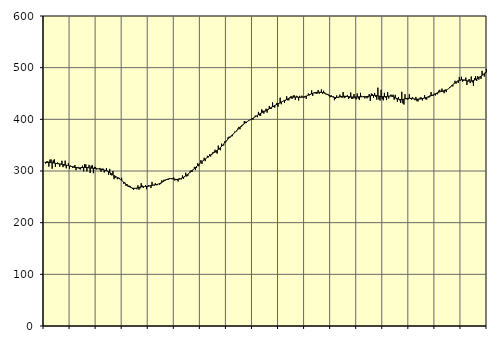
| Category | Piggar | Series 1 |
|---|---|---|
| nan | 316.8 | 316.88 |
| 87.0 | 314.3 | 316.68 |
| 87.0 | 318.7 | 316.62 |
| 87.0 | 318.7 | 316.62 |
| 87.0 | 308.5 | 316.53 |
| 87.0 | 322 | 316.45 |
| 87.0 | 322.4 | 316.24 |
| 87.0 | 304.4 | 316.01 |
| 87.0 | 320.6 | 315.75 |
| 87.0 | 322.7 | 315.37 |
| 87.0 | 307.9 | 314.99 |
| 87.0 | 313.6 | 314.59 |
| nan | 316.4 | 314.2 |
| 88.0 | 315.1 | 313.85 |
| 88.0 | 308.2 | 313.54 |
| 88.0 | 314 | 313.25 |
| 88.0 | 319.8 | 312.97 |
| 88.0 | 307.4 | 312.65 |
| 88.0 | 310 | 312.27 |
| 88.0 | 320.1 | 311.85 |
| 88.0 | 305.2 | 311.4 |
| 88.0 | 310.9 | 310.86 |
| 88.0 | 315.5 | 310.31 |
| 88.0 | 304.3 | 309.76 |
| nan | 310.4 | 309.19 |
| 89.0 | 309.2 | 308.62 |
| 89.0 | 305.9 | 308.06 |
| 89.0 | 309.1 | 307.5 |
| 89.0 | 311.6 | 306.98 |
| 89.0 | 301.5 | 306.56 |
| 89.0 | 307 | 306.28 |
| 89.0 | 307.9 | 306.14 |
| 89.0 | 303.8 | 306.12 |
| 89.0 | 302.9 | 306.19 |
| 89.0 | 307.9 | 306.34 |
| 89.0 | 310.3 | 306.51 |
| nan | 299.3 | 306.67 |
| 90.0 | 313.1 | 306.75 |
| 90.0 | 312.9 | 306.74 |
| 90.0 | 299.2 | 306.64 |
| 90.0 | 306 | 306.42 |
| 90.0 | 311.8 | 306.16 |
| 90.0 | 296.1 | 305.89 |
| 90.0 | 310.2 | 305.62 |
| 90.0 | 311.1 | 305.39 |
| 90.0 | 295.7 | 305.23 |
| 90.0 | 308.1 | 305.06 |
| 90.0 | 307.8 | 304.86 |
| nan | 303 | 304.63 |
| 91.0 | 304.5 | 304.35 |
| 91.0 | 303.9 | 303.99 |
| 91.0 | 305.9 | 303.62 |
| 91.0 | 298.7 | 303.22 |
| 91.0 | 304.6 | 302.77 |
| 91.0 | 304.5 | 302.29 |
| 91.0 | 297.1 | 301.76 |
| 91.0 | 300.6 | 301.14 |
| 91.0 | 305.7 | 300.41 |
| 91.0 | 300.4 | 299.54 |
| 91.0 | 292.4 | 298.47 |
| nan | 304.1 | 297.2 |
| 92.0 | 292.4 | 295.79 |
| 92.0 | 291.4 | 294.3 |
| 92.0 | 300 | 292.81 |
| 92.0 | 284.1 | 291.37 |
| 92.0 | 286.6 | 290.02 |
| 92.0 | 289.1 | 288.73 |
| 92.0 | 284.1 | 287.47 |
| 92.0 | 287.3 | 286.19 |
| 92.0 | 286.6 | 284.81 |
| 92.0 | 283.3 | 283.33 |
| 92.0 | 286.8 | 281.75 |
| nan | 280.1 | 280.09 |
| 93.0 | 275.3 | 278.31 |
| 93.0 | 277.6 | 276.5 |
| 93.0 | 271 | 274.65 |
| 93.0 | 274.6 | 272.84 |
| 93.0 | 269.3 | 271.21 |
| 93.0 | 271.6 | 269.76 |
| 93.0 | 270.4 | 268.53 |
| 93.0 | 268.3 | 267.57 |
| 93.0 | 265.2 | 266.9 |
| 93.0 | 263.5 | 266.5 |
| 93.0 | 267.3 | 266.4 |
| nan | 266.3 | 266.58 |
| 94.0 | 264.7 | 266.99 |
| 94.0 | 272.3 | 267.55 |
| 94.0 | 263.8 | 268.18 |
| 94.0 | 266.4 | 268.77 |
| 94.0 | 276.4 | 269.24 |
| 94.0 | 271.7 | 269.57 |
| 94.0 | 267.2 | 269.75 |
| 94.0 | 269.9 | 269.84 |
| 94.0 | 272.7 | 269.94 |
| 94.0 | 264.7 | 270.1 |
| 94.0 | 269.2 | 270.37 |
| nan | 272.6 | 270.75 |
| 95.0 | 271.1 | 271.21 |
| 95.0 | 267 | 271.72 |
| 95.0 | 279 | 272.21 |
| 95.0 | 272.9 | 272.67 |
| 95.0 | 271.8 | 273.06 |
| 95.0 | 276.4 | 273.41 |
| 95.0 | 272.5 | 273.8 |
| 95.0 | 272.7 | 274.3 |
| 95.0 | 275 | 274.96 |
| 95.0 | 273.5 | 275.79 |
| 95.0 | 275.1 | 276.83 |
| nan | 281.9 | 278 |
| 96.0 | 280.4 | 279.27 |
| 96.0 | 283.3 | 280.59 |
| 96.0 | 281.1 | 281.86 |
| 96.0 | 284.2 | 283 |
| 96.0 | 282.6 | 283.94 |
| 96.0 | 283.2 | 284.62 |
| 96.0 | 286.3 | 285.01 |
| 96.0 | 284.9 | 285.12 |
| 96.0 | 286.4 | 285.01 |
| 96.0 | 285.7 | 284.75 |
| 96.0 | 287.5 | 284.39 |
| nan | 281.5 | 284.04 |
| 97.0 | 284 | 283.76 |
| 97.0 | 282.2 | 283.66 |
| 97.0 | 279.7 | 283.76 |
| 97.0 | 286 | 284.1 |
| 97.0 | 285.2 | 284.71 |
| 97.0 | 283.7 | 285.58 |
| 97.0 | 291.4 | 286.66 |
| 97.0 | 284.8 | 287.92 |
| 97.0 | 288.2 | 289.32 |
| 97.0 | 296.7 | 290.79 |
| 97.0 | 289.3 | 292.32 |
| nan | 290.7 | 293.92 |
| 98.0 | 295.5 | 295.58 |
| 98.0 | 299.2 | 297.33 |
| 98.0 | 301.4 | 299.16 |
| 98.0 | 298.4 | 301.05 |
| 98.0 | 303.7 | 302.97 |
| 98.0 | 308 | 304.92 |
| 98.0 | 301.8 | 306.87 |
| 98.0 | 305.7 | 308.79 |
| 98.0 | 314.8 | 310.68 |
| 98.0 | 309.2 | 312.55 |
| 98.0 | 314.2 | 314.4 |
| nan | 321.1 | 316.25 |
| 99.0 | 313.8 | 318.06 |
| 99.0 | 319.3 | 319.79 |
| 99.0 | 325.7 | 321.47 |
| 99.0 | 319.1 | 323.14 |
| 99.0 | 324.5 | 324.8 |
| 99.0 | 329.4 | 326.43 |
| 99.0 | 326.4 | 328.06 |
| 99.0 | 332.3 | 329.68 |
| 99.0 | 328.1 | 331.23 |
| 99.0 | 330.9 | 332.74 |
| 99.0 | 336.3 | 334.21 |
| nan | 337.1 | 335.65 |
| 0.0 | 341.2 | 337.08 |
| 0.0 | 335.4 | 338.56 |
| 0.0 | 333.7 | 340.07 |
| 0.0 | 349.2 | 341.69 |
| 0.0 | 341.8 | 343.47 |
| 0.0 | 340.2 | 345.44 |
| 0.0 | 352.9 | 347.6 |
| 0.0 | 348.5 | 349.91 |
| 0.0 | 349.5 | 352.32 |
| 0.0 | 357.3 | 354.79 |
| 0.0 | 355.7 | 357.22 |
| nan | 358.9 | 359.55 |
| 1.0 | 365 | 361.77 |
| 1.0 | 366.5 | 363.93 |
| 1.0 | 365.1 | 366.05 |
| 1.0 | 367.1 | 368.13 |
| 1.0 | 367.4 | 370.14 |
| 1.0 | 371.4 | 372.11 |
| 1.0 | 376.1 | 374.09 |
| 1.0 | 376.1 | 376.08 |
| 1.0 | 376.8 | 378.13 |
| 1.0 | 382.2 | 380.22 |
| 1.0 | 385.4 | 382.31 |
| nan | 380.8 | 384.38 |
| 2.0 | 385 | 386.39 |
| 2.0 | 386.8 | 388.3 |
| 2.0 | 389.1 | 390.1 |
| 2.0 | 396.5 | 391.78 |
| 2.0 | 395.5 | 393.36 |
| 2.0 | 392.7 | 394.82 |
| 2.0 | 396 | 396.16 |
| 2.0 | 396.9 | 397.42 |
| 2.0 | 398.8 | 398.61 |
| 2.0 | 399.6 | 399.74 |
| 2.0 | 401.9 | 400.88 |
| nan | 399.2 | 402.08 |
| 3.0 | 403.5 | 403.39 |
| 3.0 | 407.2 | 404.8 |
| 3.0 | 406 | 406.27 |
| 3.0 | 404.2 | 407.72 |
| 3.0 | 414.4 | 409.1 |
| 3.0 | 407.6 | 410.43 |
| 3.0 | 406.9 | 411.66 |
| 3.0 | 419.4 | 412.81 |
| 3.0 | 417.1 | 413.92 |
| 3.0 | 411.1 | 415.03 |
| 3.0 | 415.1 | 416.15 |
| nan | 420.5 | 417.31 |
| 4.0 | 412.9 | 418.52 |
| 4.0 | 418.6 | 419.71 |
| 4.0 | 425.9 | 420.88 |
| 4.0 | 420.1 | 422.05 |
| 4.0 | 420.7 | 423.24 |
| 4.0 | 432.7 | 424.44 |
| 4.0 | 423.9 | 425.65 |
| 4.0 | 422.5 | 426.82 |
| 4.0 | 427.4 | 427.91 |
| 4.0 | 431.8 | 428.99 |
| 4.0 | 424.2 | 430.09 |
| nan | 431.6 | 431.18 |
| 5.0 | 441.8 | 432.26 |
| 5.0 | 429.2 | 433.36 |
| 5.0 | 434 | 434.4 |
| 5.0 | 435.9 | 435.43 |
| 5.0 | 431.6 | 436.46 |
| 5.0 | 436.3 | 437.47 |
| 5.0 | 444.7 | 438.48 |
| 5.0 | 436.8 | 439.5 |
| 5.0 | 436.9 | 440.48 |
| 5.0 | 442.8 | 441.36 |
| 5.0 | 445.2 | 442.07 |
| nan | 439.5 | 442.61 |
| 6.0 | 446 | 442.92 |
| 6.0 | 446.5 | 443.06 |
| 6.0 | 437.7 | 443.09 |
| 6.0 | 445.5 | 443.02 |
| 6.0 | 444 | 442.88 |
| 6.0 | 436.6 | 442.74 |
| 6.0 | 445.4 | 442.61 |
| 6.0 | 442.2 | 442.56 |
| 6.0 | 445.7 | 442.69 |
| 6.0 | 442.7 | 442.99 |
| 6.0 | 442 | 443.48 |
| nan | 445.2 | 444.14 |
| 7.0 | 439.5 | 444.94 |
| 7.0 | 445.9 | 445.82 |
| 7.0 | 450.1 | 446.76 |
| 7.0 | 446.6 | 447.72 |
| 7.0 | 447.9 | 448.62 |
| 7.0 | 456.1 | 449.48 |
| 7.0 | 445.4 | 450.26 |
| 7.0 | 451.3 | 450.92 |
| 7.0 | 452.9 | 451.45 |
| 7.0 | 449.8 | 451.85 |
| 7.0 | 449.6 | 452.13 |
| nan | 456.8 | 452.31 |
| 8.0 | 449.5 | 452.38 |
| 8.0 | 451.6 | 452.33 |
| 8.0 | 457.9 | 452.09 |
| 8.0 | 449.6 | 451.7 |
| 8.0 | 455.3 | 451.15 |
| 8.0 | 452 | 450.43 |
| 8.0 | 448.5 | 449.54 |
| 8.0 | 447.8 | 448.56 |
| 8.0 | 449.2 | 447.49 |
| 8.0 | 447.1 | 446.39 |
| 8.0 | 442.9 | 445.34 |
| nan | 446.6 | 444.36 |
| 9.0 | 444 | 443.51 |
| 9.0 | 444.3 | 442.89 |
| 9.0 | 437 | 442.5 |
| 9.0 | 439.3 | 442.34 |
| 9.0 | 446.3 | 442.45 |
| 9.0 | 442.1 | 442.78 |
| 9.0 | 442.2 | 443.2 |
| 9.0 | 447.8 | 443.66 |
| 9.0 | 442.9 | 444.1 |
| 9.0 | 441.7 | 444.42 |
| 9.0 | 452.9 | 444.6 |
| nan | 441.1 | 444.66 |
| 10.0 | 442.5 | 444.56 |
| 10.0 | 445.4 | 444.36 |
| 10.0 | 446.7 | 444.14 |
| 10.0 | 439.4 | 443.92 |
| 10.0 | 441.2 | 443.66 |
| 10.0 | 452 | 443.42 |
| 10.0 | 439.4 | 443.23 |
| 10.0 | 439.8 | 443.12 |
| 10.0 | 449 | 443.08 |
| 10.0 | 440.8 | 443.14 |
| 10.0 | 438.6 | 443.27 |
| nan | 450.1 | 443.39 |
| 11.0 | 440.1 | 443.53 |
| 11.0 | 437.4 | 443.62 |
| 11.0 | 451.2 | 443.64 |
| 11.0 | 445.4 | 443.64 |
| 11.0 | 443.3 | 443.63 |
| 11.0 | 444.9 | 443.64 |
| 11.0 | 440.6 | 443.72 |
| 11.0 | 444.5 | 443.88 |
| 11.0 | 440.6 | 444.12 |
| 11.0 | 442.5 | 444.48 |
| 11.0 | 449 | 444.9 |
| nan | 435.7 | 445.35 |
| 12.0 | 449.9 | 445.8 |
| 12.0 | 448.6 | 446.17 |
| 12.0 | 441.8 | 446.38 |
| 12.0 | 451 | 446.41 |
| 12.0 | 443.4 | 446.23 |
| 12.0 | 438.1 | 445.9 |
| 12.0 | 461.3 | 445.48 |
| 12.0 | 438.3 | 445.03 |
| 12.0 | 436.4 | 444.58 |
| 12.0 | 457.3 | 444.21 |
| 12.0 | 439.4 | 443.95 |
| nan | 436.7 | 443.83 |
| 13.0 | 451.3 | 443.86 |
| 13.0 | 442.4 | 444.05 |
| 13.0 | 437.2 | 444.35 |
| 13.0 | 452.6 | 444.7 |
| 13.0 | 440.4 | 445.01 |
| 13.0 | 444.9 | 445.13 |
| 13.0 | 447.9 | 445 |
| 13.0 | 446.2 | 444.6 |
| 13.0 | 447.7 | 443.98 |
| 13.0 | 438 | 443.12 |
| 13.0 | 447.4 | 442.06 |
| nan | 439 | 440.99 |
| 14.0 | 434 | 439.97 |
| 14.0 | 443.3 | 439.07 |
| 14.0 | 436.7 | 438.46 |
| 14.0 | 431.8 | 438.17 |
| 14.0 | 453.3 | 438.17 |
| 14.0 | 430.8 | 438.47 |
| 14.0 | 428.7 | 438.94 |
| 14.0 | 448.6 | 439.49 |
| 14.0 | 440.8 | 440.06 |
| 14.0 | 438.3 | 440.56 |
| 14.0 | 438.9 | 440.89 |
| nan | 448.6 | 440.99 |
| 15.0 | 439.5 | 440.9 |
| 15.0 | 438.2 | 440.64 |
| 15.0 | 442.7 | 440.22 |
| 15.0 | 439.3 | 439.73 |
| 15.0 | 437 | 439.29 |
| 15.0 | 443.4 | 438.96 |
| 15.0 | 435 | 438.86 |
| 15.0 | 434.9 | 438.94 |
| 15.0 | 439.9 | 439.09 |
| 15.0 | 442.3 | 439.34 |
| 15.0 | 442.2 | 439.69 |
| nan | 436.4 | 440.12 |
| 16.0 | 441.4 | 440.61 |
| 16.0 | 447 | 441.2 |
| 16.0 | 438.7 | 441.88 |
| 16.0 | 438.3 | 442.59 |
| 16.0 | 443.5 | 443.31 |
| 16.0 | 441.8 | 444.04 |
| 16.0 | 446.2 | 444.78 |
| 16.0 | 452.9 | 445.58 |
| 16.0 | 445.3 | 446.48 |
| 16.0 | 445.6 | 447.43 |
| 16.0 | 449.6 | 448.45 |
| nan | 446.1 | 449.5 |
| 17.0 | 448.8 | 450.54 |
| 17.0 | 448.5 | 451.51 |
| 17.0 | 455.3 | 452.37 |
| 17.0 | 457.2 | 453.14 |
| 17.0 | 453.9 | 453.83 |
| 17.0 | 459.5 | 454.43 |
| 17.0 | 453.6 | 454.96 |
| 17.0 | 450.6 | 455.46 |
| 17.0 | 457.7 | 456.05 |
| 17.0 | 452.7 | 456.86 |
| 17.0 | 457.8 | 457.94 |
| nan | 459.4 | 459.3 |
| 18.0 | 462.3 | 460.92 |
| 18.0 | 463.3 | 462.75 |
| 18.0 | 465.9 | 464.74 |
| 18.0 | 463.7 | 466.75 |
| 18.0 | 469.2 | 468.67 |
| 18.0 | 474.6 | 470.49 |
| 18.0 | 469.1 | 472.15 |
| 18.0 | 473.4 | 473.61 |
| 18.0 | 470.3 | 474.81 |
| 18.0 | 481.9 | 475.69 |
| 18.0 | 475 | 476.23 |
| nan | 482.3 | 476.49 |
| 19.0 | 473 | 476.49 |
| 19.0 | 474.6 | 476.23 |
| 19.0 | 476.5 | 475.78 |
| 19.0 | 480.8 | 475.23 |
| 19.0 | 466.4 | 474.7 |
| 19.0 | 473.6 | 474.27 |
| 19.0 | 478 | 474.03 |
| 19.0 | 470.1 | 474.01 |
| 19.0 | 482.9 | 474.21 |
| 19.0 | 471.6 | 474.62 |
| 19.0 | 464.7 | 475.22 |
| nan | 479.4 | 475.98 |
| 20.0 | 483.7 | 476.91 |
| 20.0 | 474.3 | 478.03 |
| 20.0 | 483.4 | 479.3 |
| 20.0 | 476.9 | 480.7 |
| 20.0 | 481.5 | 482.2 |
| 20.0 | 478.3 | 483.78 |
| 20.0 | 493.9 | 485.35 |
| 20.0 | 486.9 | 486.87 |
| 20.0 | 482.9 | 488.34 |
| 20.0 | 491.7 | 489.73 |
| 20.0 | 497.3 | 491.08 |